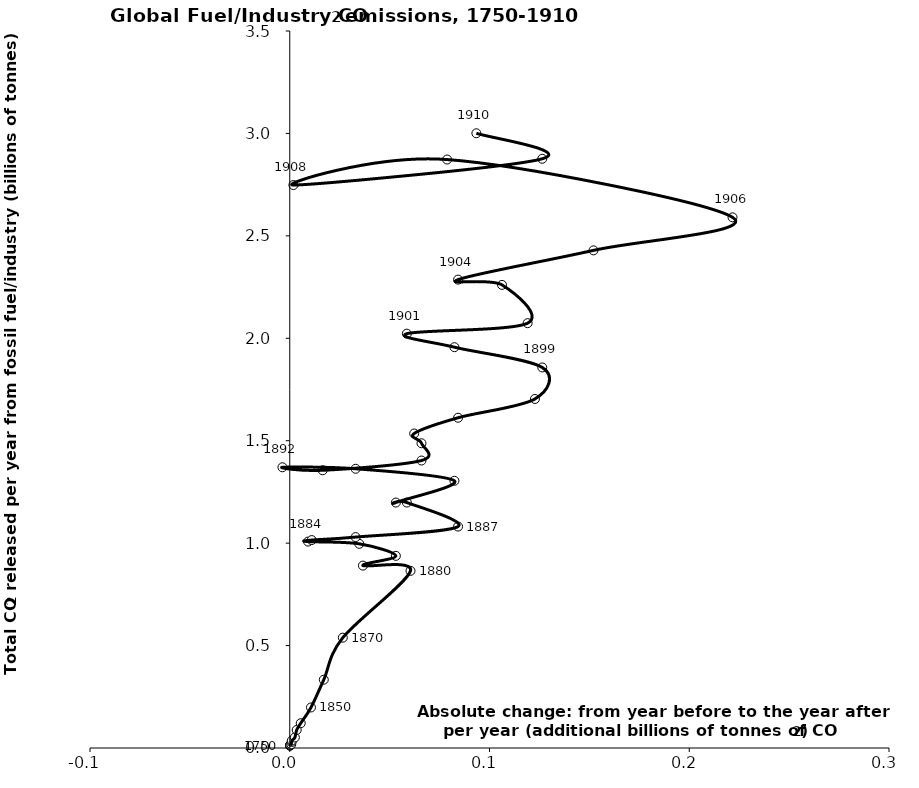
| Category | Series 0 |
|---|---|
| 0.00012213333333333328 | 0.011 |
| 0.00012213333333333328 | 0.012 |
| 0.0001221333333333334 | 0.013 |
| 0.0002442666666666667 | 0.015 |
| 0.0007328 | 0.018 |
| 0.0009159999999999999 | 0.029 |
| 0.0010992 | 0.037 |
| 0.0025648 | 0.051 |
| 0.0034808000000000005 | 0.088 |
| 0.005496 | 0.121 |
| 0.010625599999999999 | 0.198 |
| 0.017037599999999996 | 0.333 |
| 0.026563999999999997 | 0.539 |
| 0.060456 | 0.865 |
| 0.036640000000000006 | 0.89 |
| 0.053128000000000064 | 0.938 |
| 0.034808000000000006 | 0.997 |
| 0.009159999999999946 | 1.008 |
| 0.010992000000000002 | 1.015 |
| 0.032976000000000005 | 1.03 |
| 0.08427200000000001 | 1.081 |
| 0.05862400000000001 | 1.198 |
| 0.05312799999999995 | 1.198 |
| 0.08243999999999996 | 1.304 |
| 0.032976000000000005 | 1.363 |
| -0.0036640000000000006 | 1.37 |
| 0.016488000000000058 | 1.356 |
| 0.06595200000000012 | 1.403 |
| 0.0659519999999999 | 1.488 |
| 0.0622879999999999 | 1.535 |
| 0.08427200000000012 | 1.612 |
| 0.12274400000000008 | 1.704 |
| 0.12640799999999996 | 1.858 |
| 0.08244000000000007 | 1.957 |
| 0.05862400000000001 | 2.023 |
| 0.11907999999999985 | 2.074 |
| 0.1062559999999999 | 2.261 |
| 0.08427200000000012 | 2.286 |
| 0.15205599999999997 | 2.429 |
| 0.22167199999999987 | 2.59 |
| 0.07877600000000018 | 2.873 |
| 0.0018320000000000558 | 2.748 |
| 0.12640799999999985 | 2.876 |
| 0.09343199999999996 | 3.001 |